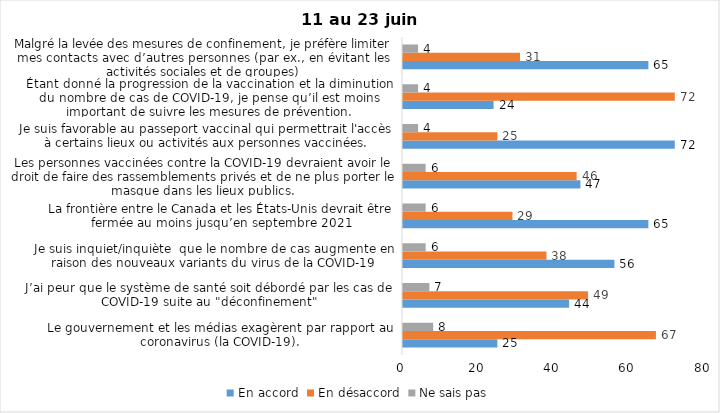
| Category | En accord | En désaccord | Ne sais pas |
|---|---|---|---|
| Le gouvernement et les médias exagèrent par rapport au coronavirus (la COVID-19). | 25 | 67 | 8 |
| J’ai peur que le système de santé soit débordé par les cas de COVID-19 suite au "déconfinement" | 44 | 49 | 7 |
| Je suis inquiet/inquiète  que le nombre de cas augmente en raison des nouveaux variants du virus de la COVID-19 | 56 | 38 | 6 |
| La frontière entre le Canada et les États-Unis devrait être fermée au moins jusqu’en septembre 2021 | 65 | 29 | 6 |
| Les personnes vaccinées contre la COVID-19 devraient avoir le droit de faire des rassemblements privés et de ne plus porter le masque dans les lieux publics. | 47 | 46 | 6 |
| Je suis favorable au passeport vaccinal qui permettrait l'accès à certains lieux ou activités aux personnes vaccinées. | 72 | 25 | 4 |
| Étant donné la progression de la vaccination et la diminution du nombre de cas de COVID-19, je pense qu’il est moins important de suivre les mesures de prévention. | 24 | 72 | 4 |
| Malgré la levée des mesures de confinement, je préfère limiter mes contacts avec d’autres personnes (par ex., en évitant les activités sociales et de groupes) | 65 | 31 | 4 |